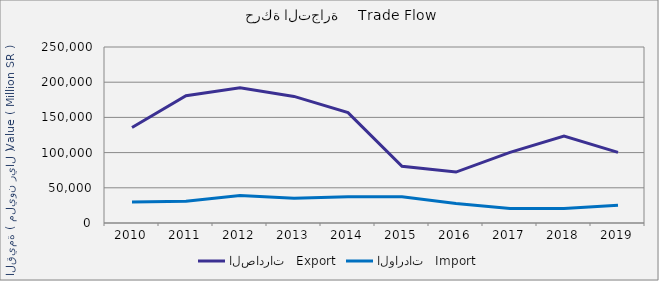
| Category | الصادرات   Export | الواردات   Import |
|---|---|---|
| 2010.0 | 135633964803 | 29956530408 |
| 2011.0 | 180828030890 | 31064897876 |
| 2012.0 | 192201479929 | 38988506822 |
| 2013.0 | 179825355732 | 35153452131 |
| 2014.0 | 156821228290 | 37306115946 |
| 2015.0 | 80682659035 | 37286013756 |
| 2016.0 | 72342363619 | 27820758728 |
| 2017.0 | 100382168817 | 20568996431 |
| 2018.0 | 123645812997 | 20589631256 |
| 2019.0 | 100365056942 | 25366865634 |